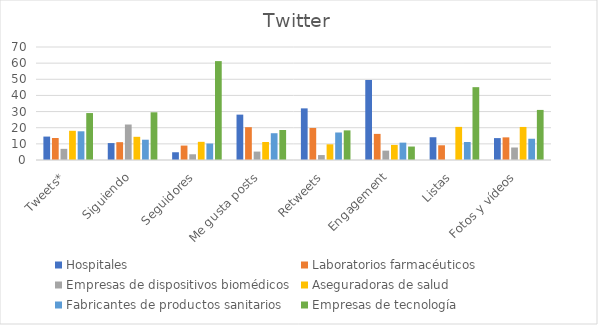
| Category | Hospitales | Laboratorios farmacéuticos | Empresas de dispositivos biomédicos | Aseguradoras de salud | Fabricantes de productos sanitarios | Empresas de tecnología |
|---|---|---|---|---|---|---|
| Tweets* | 14.508 | 13.619 | 6.913 | 18.098 | 17.78 | 29.082 |
| Siguiendo | 10.479 | 11.046 | 21.987 | 14.367 | 12.566 | 29.555 |
| Seguidores | 4.798 | 8.935 | 3.545 | 11.259 | 10.205 | 61.258 |
| Me gusta posts | 28.107 | 20.332 | 5.219 | 11.162 | 16.588 | 18.592 |
| Retweets | 31.984 | 19.85 | 3.059 | 9.716 | 17.041 | 18.352 |
| Engagement | 49.579 | 16.179 | 5.801 | 9.341 | 10.761 | 8.339 |
| Listas | 14.1 | 9.115 | 0 | 20.509 | 11.157 | 45.119 |
| Fotos y vídeos | 13.567 | 14.027 | 7.74 | 20.474 | 13.168 | 31.024 |